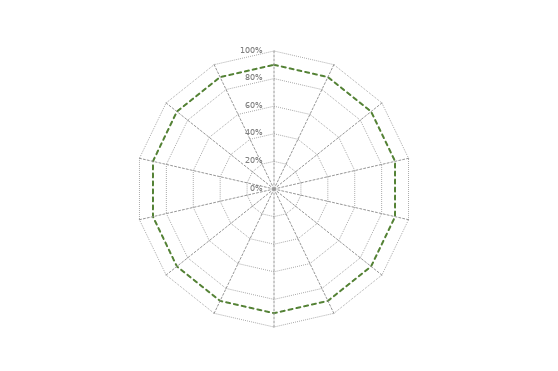
| Category | RADAR des AXES | 90% |
|---|---|---|
| A.5 Politiques de sécurité de l’information | 0 | 0.9 |
| A.6 Organisation de la sécurité de l’information | 0 | 0.9 |
| A.7 Sécurité des ressources humaines | 0 | 0.9 |
| A.8 Gestion des actifs  | 0 | 0.9 |
| A.9 Contrôle d’accès | 0 | 0.9 |
| A.10 Cryptographie | 0 | 0.9 |
| A.11 Sécurité physique et environnementale | 0 | 0.9 |
| A.12 Sécurité liée à l’exploitation | 0 | 0.9 |
| A.13 Sécurité des communications | 0 | 0.9 |
| A.14 Acquisition, développement et maintenance des systèmes d’information | 0 | 0.9 |
| A.15 Sécurité liée à l’exploitation | 0 | 0.9 |
| A.16  Relations avec les fournisseurs | 0 | 0.9 |
| A.17 Sécurité de l’information dans la gestion de la continuité de l’activité | 0 | 0.9 |
| A.18 Conformité | 0 | 0.9 |